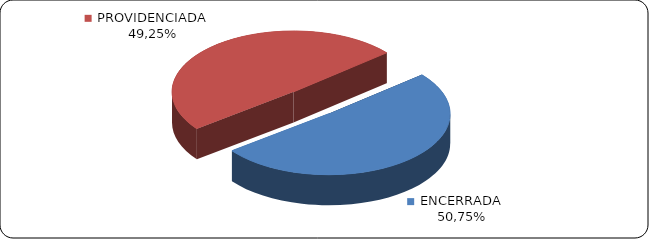
| Category | Series 0 |
|---|---|
|      ENCERRADA | 0.507 |
|      PROVIDENCIADA | 0.492 |